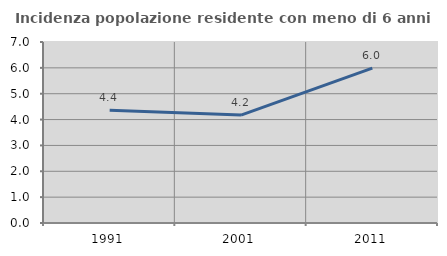
| Category | Incidenza popolazione residente con meno di 6 anni |
|---|---|
| 1991.0 | 4.357 |
| 2001.0 | 4.173 |
| 2011.0 | 5.992 |